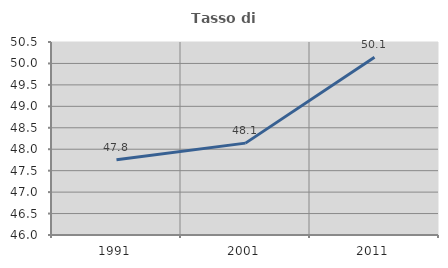
| Category | Tasso di occupazione   |
|---|---|
| 1991.0 | 47.754 |
| 2001.0 | 48.142 |
| 2011.0 | 50.144 |